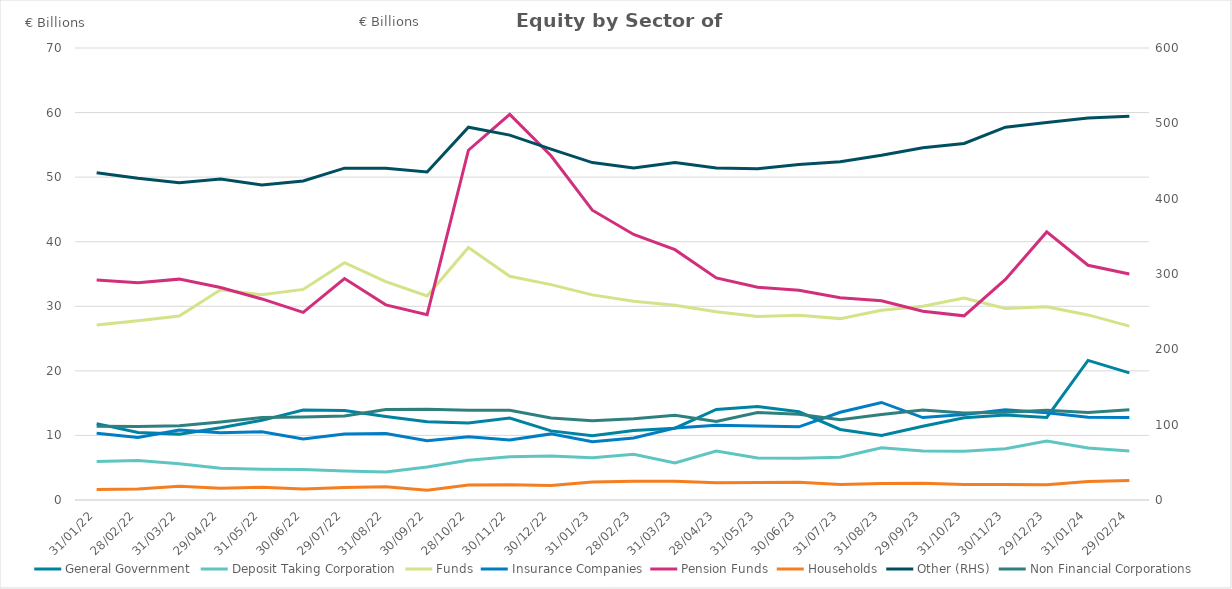
| Category | General Government | Deposit Taking Corporation | Funds | Insurance Companies | Pension Funds | Households |
|---|---|---|---|---|---|---|
| 2022-01-31 | 11.83 | 5.979 | 27.104 | 10.339 | 34.076 | 1.641 |
| 2022-02-28 | 10.462 | 6.126 | 27.762 | 9.668 | 33.63 | 1.717 |
| 2022-03-31 | 10.202 | 5.627 | 28.481 | 10.836 | 34.204 | 2.145 |
| 2022-04-29 | 11.185 | 4.919 | 32.57 | 10.408 | 32.918 | 1.813 |
| 2022-05-31 | 12.338 | 4.769 | 31.799 | 10.557 | 31.137 | 1.987 |
| 2022-06-30 | 13.939 | 4.742 | 32.614 | 9.465 | 29.053 | 1.713 |
| 2022-07-29 | 13.855 | 4.501 | 36.745 | 10.203 | 34.288 | 1.936 |
| 2022-08-31 | 12.915 | 4.338 | 33.822 | 10.296 | 30.219 | 2.051 |
| 2022-09-30 | 12.11 | 5.108 | 31.609 | 9.173 | 28.713 | 1.527 |
| 2022-10-28 | 11.933 | 6.139 | 39.096 | 9.785 | 54.166 | 2.317 |
| 2022-11-30 | 12.703 | 6.699 | 34.643 | 9.296 | 59.725 | 2.355 |
| 2022-12-30 | 10.702 | 6.826 | 33.354 | 10.238 | 53.309 | 2.245 |
| 2023-01-31 | 9.96 | 6.532 | 31.769 | 9.038 | 44.881 | 2.784 |
| 2023-02-28 | 10.751 | 7.083 | 30.764 | 9.604 | 41.117 | 2.905 |
| 2023-03-31 | 11.116 | 5.732 | 30.16 | 11.158 | 38.761 | 2.921 |
| 2023-04-28 | 14.019 | 7.587 | 29.146 | 11.566 | 34.389 | 2.668 |
| 2023-05-31 | 14.493 | 6.498 | 28.416 | 11.451 | 32.958 | 2.706 |
| 2023-06-30 | 13.667 | 6.448 | 28.62 | 11.331 | 32.478 | 2.751 |
| 2023-07-31 | 10.921 | 6.639 | 28.091 | 13.579 | 31.31 | 2.386 |
| 2023-08-31 | 10.007 | 8.09 | 29.391 | 15.107 | 30.857 | 2.541 |
| 2023-09-29 | 11.424 | 7.586 | 30.014 | 12.768 | 29.241 | 2.605 |
| 2023-10-31 | 12.743 | 7.569 | 31.289 | 13.229 | 28.523 | 2.415 |
| 2023-11-30 | 13.168 | 7.946 | 29.654 | 13.97 | 34.162 | 2.415 |
| 2023-12-29 | 12.786 | 9.134 | 29.925 | 13.528 | 41.516 | 2.345 |
| 2024-01-31 | 21.623 | 8.055 | 28.664 | 12.813 | 36.356 | 2.876 |
| 2024-02-29 | 19.686 | 7.583 | 26.935 | 12.758 | 34.987 | 3.011 |